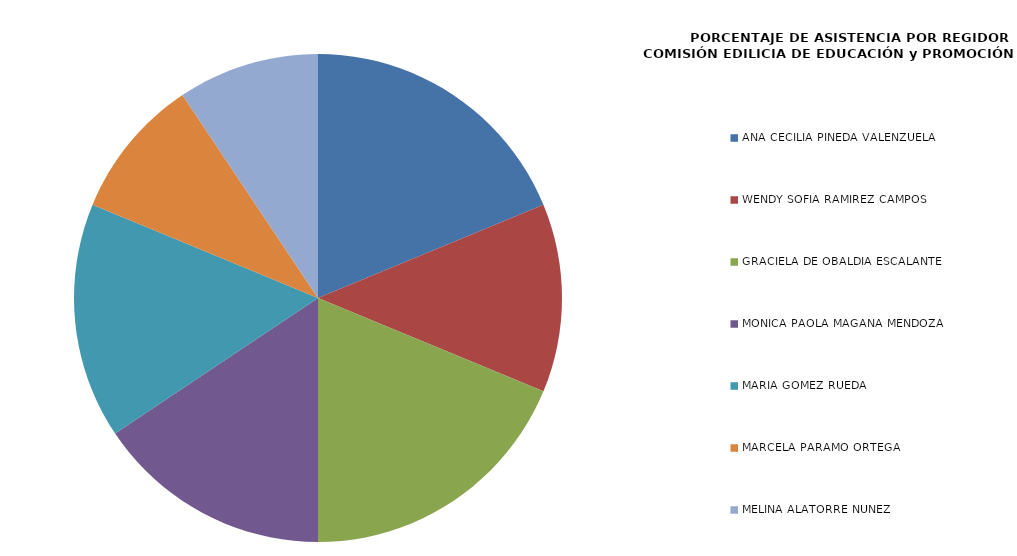
| Category | Series 0 |
|---|---|
| ANA CECILIA PINEDA VALENZUELA | 100 |
| WENDY SOFÍA RAMÍREZ CAMPOS | 66.667 |
| GRACIELA DE OBALDÍA ESCALANTE | 100 |
| MÓNICA PAOLA MAGAÑA MENDOZA | 83.333 |
| MARÍA GÓMEZ RUEDA | 83.333 |
| MARCELA PÁRAMO ORTEGA | 50 |
| MELINA ALATORRE NÚÑEZ | 50 |